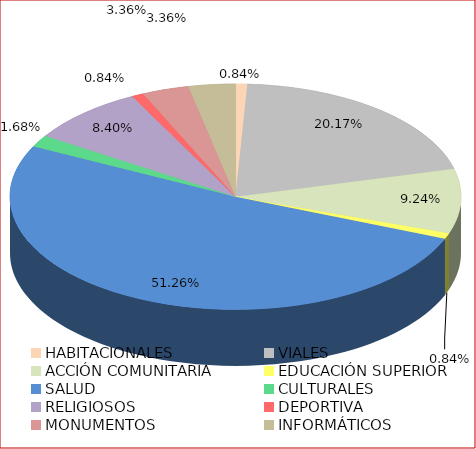
| Category | EJECUTORIAS 2017 POR LÍNEA DE ACCIÓN |
|---|---|
| HABITACIONALES | 0.008 |
| VIALES | 0.202 |
| ACCIÓN COMUNITARIA | 0.092 |
| EDUCACIÓN SUPERIOR | 0.008 |
| SALUD | 0.513 |
| CULTURALES | 0.017 |
| RELIGIOSOS | 0.084 |
| DEPORTIVA | 0.008 |
| MONUMENTOS | 0.034 |
| INFORMÁTICOS | 0.034 |